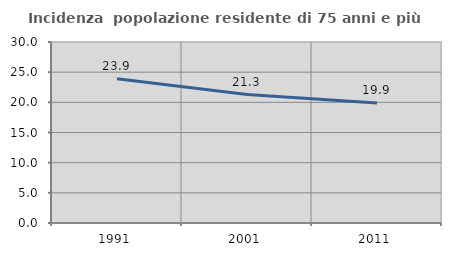
| Category | Incidenza  popolazione residente di 75 anni e più |
|---|---|
| 1991.0 | 23.913 |
| 2001.0 | 21.29 |
| 2011.0 | 19.876 |